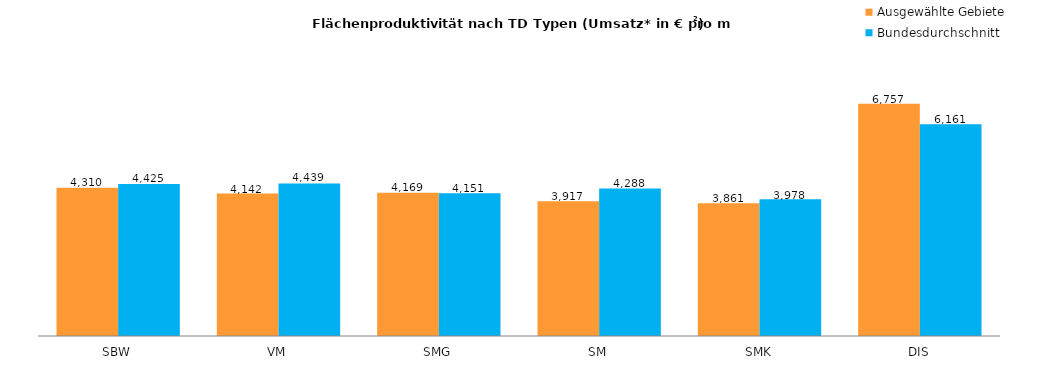
| Category |  Ausgewählte Gebiete |  Bundesdurchschnitt |
|---|---|---|
| SBW | 4309.535 | 4424.698 |
| VM | 4142.027 | 4439.39 |
| SMG | 4169.275 | 4151.431 |
| SM | 3916.825 | 4288.012 |
| SMK | 3860.53 | 3978.337 |
| DIS | 6756.799 | 6161.106 |